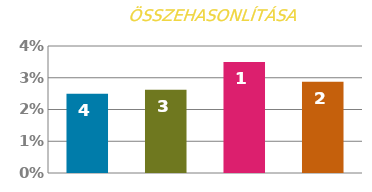
| Category | KAMATLÁB |
|---|---|
| 0 | 0.025 |
| 1 | 0.026 |
| 2 | 0.035 |
| 3 | 0.029 |